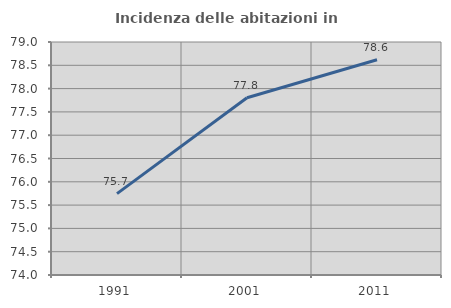
| Category | Incidenza delle abitazioni in proprietà  |
|---|---|
| 1991.0 | 75.746 |
| 2001.0 | 77.805 |
| 2011.0 | 78.62 |